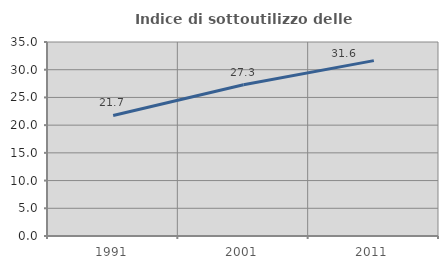
| Category | Indice di sottoutilizzo delle abitazioni  |
|---|---|
| 1991.0 | 21.742 |
| 2001.0 | 27.291 |
| 2011.0 | 31.64 |